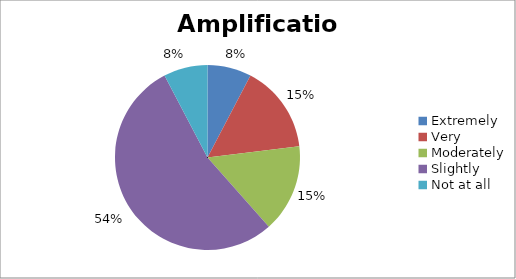
| Category | Amplification |
|---|---|
| Extremely | 1 |
| Very | 2 |
| Moderately | 2 |
| Slightly | 7 |
| Not at all | 1 |